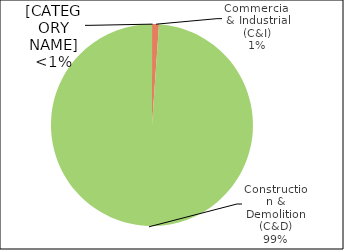
| Category | Series 0 |
|---|---|
| Municipal (MSW) | 560 |
| Commercial & Industrial (C&I) | 60386 |
| Construction & Demolition (C&D) | 5446263 |